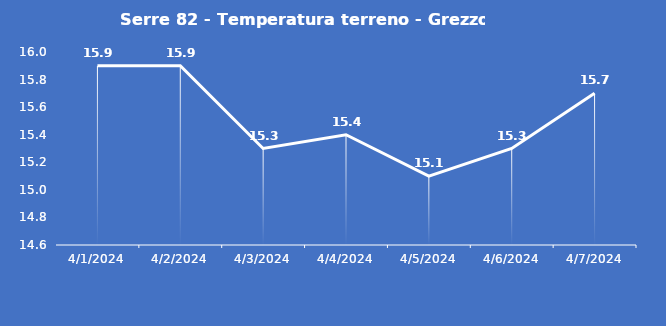
| Category | Serre 82 - Temperatura terreno - Grezzo (°C) |
|---|---|
| 4/1/24 | 15.9 |
| 4/2/24 | 15.9 |
| 4/3/24 | 15.3 |
| 4/4/24 | 15.4 |
| 4/5/24 | 15.1 |
| 4/6/24 | 15.3 |
| 4/7/24 | 15.7 |